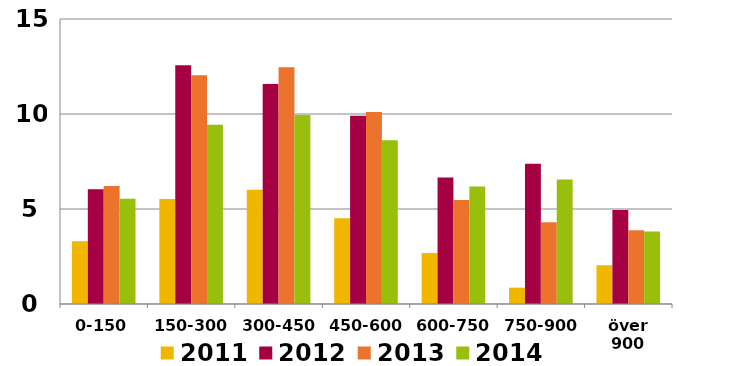
| Category | 2011 | 2012 | 2013 | 2014 |
|---|---|---|---|---|
| 0-150 | 3.304 | 6.042 | 6.205 | 5.543 |
| 150-300 | 5.532 | 12.562 | 12.042 | 9.433 |
| 300-450 | 6.013 | 11.576 | 12.462 | 9.942 |
| 450-600 | 4.509 | 9.902 | 10.108 | 8.619 |
| 600-750 | 2.679 | 6.66 | 5.477 | 6.184 |
| 750-900 | 0.86 | 7.386 | 4.297 | 6.551 |
| över 900 | 2.041 | 4.95 | 3.876 | 3.818 |